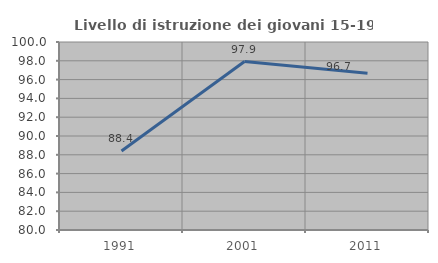
| Category | Livello di istruzione dei giovani 15-19 anni |
|---|---|
| 1991.0 | 88.406 |
| 2001.0 | 97.917 |
| 2011.0 | 96.667 |